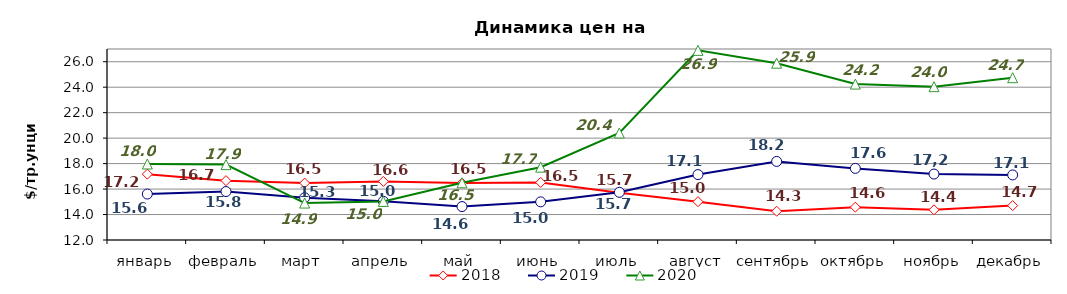
| Category | 2018 | 2019 | 2020 |
|---|---|---|---|
| январь | 17.17 | 15.61 | 17.97 |
| февраль | 16.66 | 15.806 | 17.92 |
| март | 16.47 | 15.32 | 14.9 |
| апрель | 16.6 | 15.042 | 15.03 |
| май | 16.47 | 14.625 | 16.493 |
| июнь | 16.52 | 14.996 | 17.72 |
| июль | 15.71 | 15.745 | 20.405 |
| август | 15.01 | 17.138 | 26.893 |
| сентябрь | 14.26 | 18.17 | 25.886 |
| октябрь | 14.58 | 17.625 | 24.246 |
| ноябрь | 14.37 | 17.18 | 24.043 |
| декабрь | 14.7 | 17.11 | 24.745 |